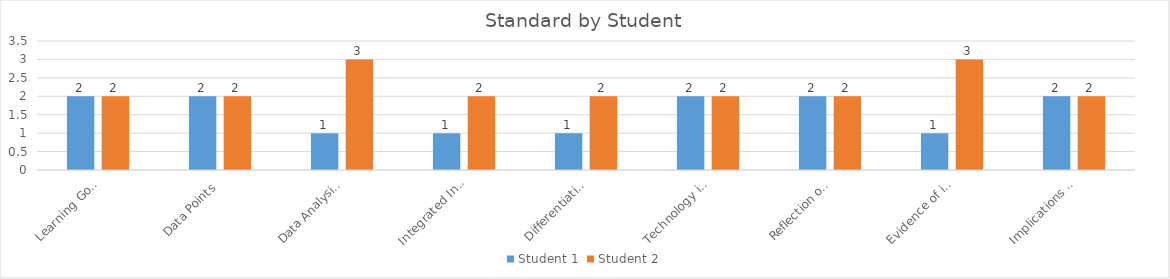
| Category | Student 1 | Student 2 |
|---|---|---|
| Learning Goals Aligned with Pre-/Post-assessments ACEI 4.0 | 2 | 2 |
| Data Points | 2 | 2 |
| Data Analysis for Pedagogical Decisions ACEI 4.0 | 1 | 3 |
| Integrated Instruction ACEI 3.1 | 1 | 2 |
| Differentiation based on knowledge of individual learning ACEI 3.2 | 1 | 2 |
| Technology integration | 2 | 2 |
| Reflection on pedagogical decisions ACEI 1.0 | 2 | 2 |
| Evidence of impact on student learning ACEI 5.1 | 1 | 3 |
| Implications for teaching and professional development ACEI 5.1 | 2 | 2 |